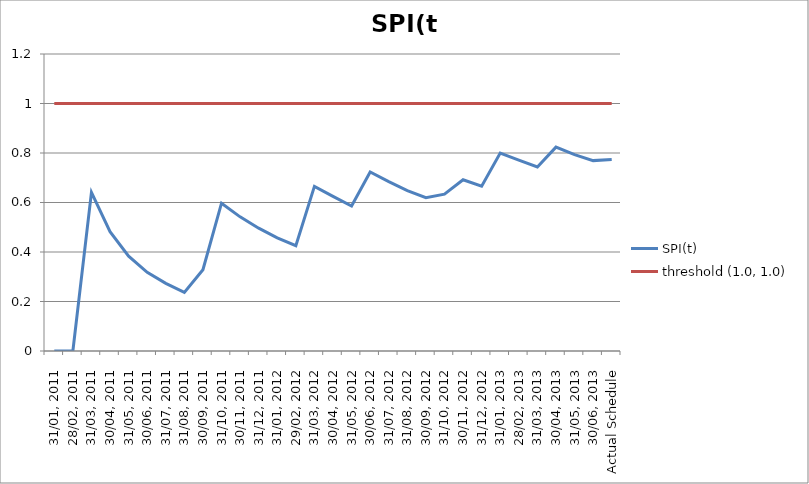
| Category | SPI(t) | threshold (1.0, 1.0) |
|---|---|---|
| 31/01, 2011 | 0 | 1 |
| 28/02, 2011 | 0 | 1 |
| 31/03, 2011 | 0.641 | 1 |
| 30/04, 2011 | 0.482 | 1 |
| 31/05, 2011 | 0.383 | 1 |
| 30/06, 2011 | 0.318 | 1 |
| 31/07, 2011 | 0.273 | 1 |
| 31/08, 2011 | 0.237 | 1 |
| 30/09, 2011 | 0.328 | 1 |
| 31/10, 2011 | 0.597 | 1 |
| 30/11, 2011 | 0.542 | 1 |
| 31/12, 2011 | 0.496 | 1 |
| 31/01, 2012 | 0.457 | 1 |
| 29/02, 2012 | 0.426 | 1 |
| 31/03, 2012 | 0.665 | 1 |
| 30/04, 2012 | 0.625 | 1 |
| 31/05, 2012 | 0.586 | 1 |
| 30/06, 2012 | 0.723 | 1 |
| 31/07, 2012 | 0.684 | 1 |
| 31/08, 2012 | 0.648 | 1 |
| 30/09, 2012 | 0.62 | 1 |
| 31/10, 2012 | 0.634 | 1 |
| 30/11, 2012 | 0.692 | 1 |
| 31/12, 2012 | 0.666 | 1 |
| 31/01, 2013 | 0.8 | 1 |
| 28/02, 2013 | 0.771 | 1 |
| 31/03, 2013 | 0.744 | 1 |
| 30/04, 2013 | 0.824 | 1 |
| 31/05, 2013 | 0.794 | 1 |
| 30/06, 2013 | 0.769 | 1 |
| Actual Schedule | 0.774 | 1 |